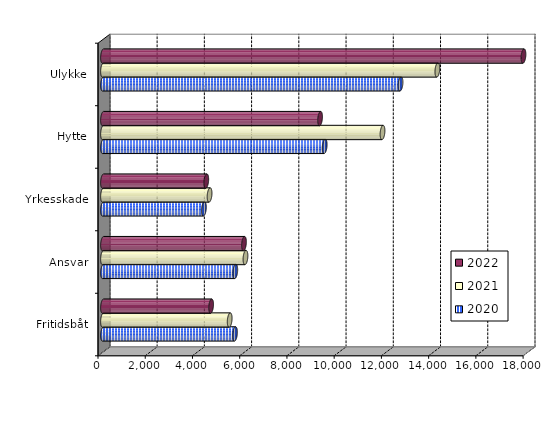
| Category | 2020 | 2021 | 2022 |
|---|---|---|---|
| Fritidsbåt | 5589.244 | 5363.97 | 4577.572 |
| Ansvar | 5601.337 | 6032.47 | 5969.292 |
| Yrkesskade | 4272.127 | 4512.347 | 4372.764 |
| Hytte | 9385.896 | 11835 | 9190.961 |
| Ulykke | 12597.658 | 14157.14 | 17803.26 |